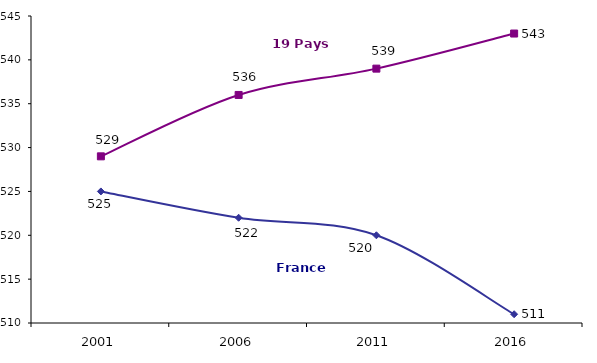
| Category | France | 19 pays |
|---|---|---|
| 2001.0 | 525 | 529 |
| 2006.0 | 522 | 536 |
| 2011.0 | 520 | 539 |
| 2016.0 | 511 | 543 |